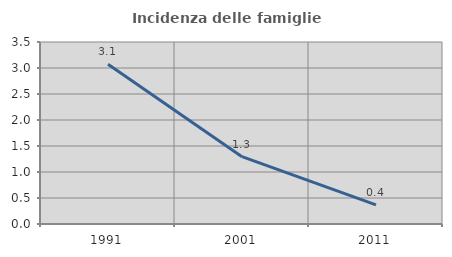
| Category | Incidenza delle famiglie numerose |
|---|---|
| 1991.0 | 3.072 |
| 2001.0 | 1.295 |
| 2011.0 | 0.368 |